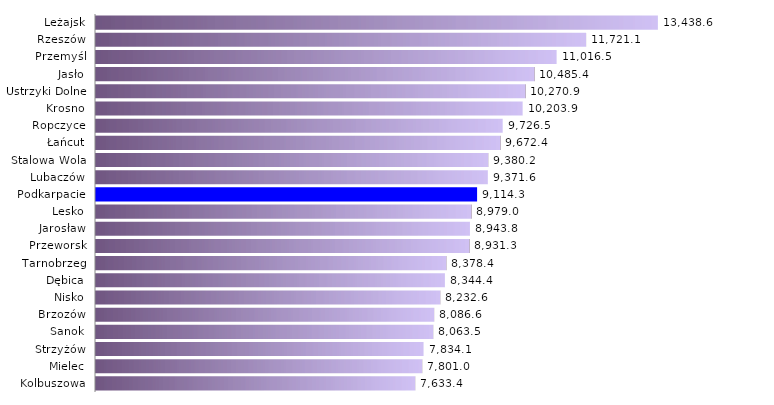
| Category | Prace interwencyjne |
|---|---|
| Kolbuszowa | 7633.375 |
| Mielec | 7801.02 |
| Strzyżów | 7834.081 |
| Sanok | 8063.538 |
| Brzozów | 8086.604 |
| Nisko | 8232.591 |
| Dębica | 8344.448 |
| Tarnobrzeg | 8378.37 |
| Przeworsk | 8931.342 |
| Jarosław | 8943.8 |
| Lesko | 8979.049 |
| Podkarpacie | 9114.348 |
| Lubaczów | 9371.58 |
| Stalowa Wola | 9380.227 |
| Łańcut | 9672.426 |
| Ropczyce | 9726.491 |
| Krosno | 10203.95 |
| Ustrzyki Dolne | 10270.884 |
| Jasło | 10485.38 |
| Przemyśl | 11016.451 |
| Rzeszów | 11721.125 |
| Leżajsk | 13438.638 |